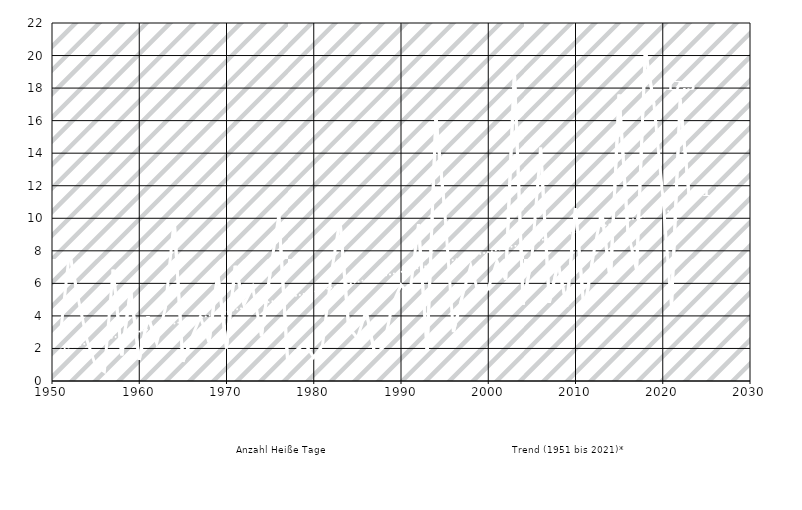
| Category | Anzahl Heiße Tage  |
|---|---|
| 1951.0 | 3.02 |
| 1952.0 | 7.91 |
| 1953.0 | 5.08 |
| 1954.0 | 2.53 |
| 1955.0 | 0.93 |
| 1956.0 | 0.58 |
| 1957.0 | 6.85 |
| 1958.0 | 1.58 |
| 1959.0 | 5.63 |
| 1960.0 | 1.3 |
| 1961.0 | 3.97 |
| 1962.0 | 2.34 |
| 1963.0 | 4.5 |
| 1964.0 | 9.93 |
| 1965.0 | 1.18 |
| 1966.0 | 2.64 |
| 1967.0 | 3.95 |
| 1968.0 | 2.38 |
| 1969.0 | 6.63 |
| 1970.0 | 2.01 |
| 1971.0 | 7.08 |
| 1972.0 | 4.7 |
| 1973.0 | 5.78 |
| 1974.0 | 2.75 |
| 1975.0 | 6.63 |
| 1976.0 | 10.2 |
| 1977.0 | 1.25 |
| 1978.0 | 1.89 |
| 1979.0 | 2.29 |
| 1980.0 | 1.45 |
| 1981.0 | 2.19 |
| 1982.0 | 6.54 |
| 1983.0 | 9.93 |
| 1984.0 | 3.3 |
| 1985.0 | 2.63 |
| 1986.0 | 4.31 |
| 1987.0 | 1.64 |
| 1988.0 | 2.1 |
| 1989.0 | 4.67 |
| 1990.0 | 5.91 |
| 1991.0 | 5.27 |
| 1992.0 | 9.64 |
| 1993.0 | 1.89 |
| 1994.0 | 16.27 |
| 1995.0 | 10.54 |
| 1996.0 | 3 |
| 1997.0 | 5.16 |
| 1998.0 | 7.08 |
| 1999.0 | 5.16 |
| 2000.0 | 5.67 |
| 2001.0 | 7.36 |
| 2002.0 | 6.23 |
| 2003.0 | 19.01 |
| 2004.0 | 4.7 |
| 2005.0 | 7.57 |
| 2006.0 | 14.34 |
| 2007.0 | 4.82 |
| 2008.0 | 7.24 |
| 2009.0 | 4.58 |
| 2010.0 | 10.63 |
| 2011.0 | 4.27 |
| 2012.0 | 7.62 |
| 2013.0 | 10.47 |
| 2014.0 | 6.14 |
| 2015.0 | 17.6 |
| 2016.0 | 9.21 |
| 2017.0 | 6.8 |
| 2018.0 | 20.37 |
| 2019.0 | 16.97 |
| 2020.0 | 11.39 |
| 2021.0 | 4.53 |
| 2022.0 | 17.3 |
| 2023.0 | 11.5 |